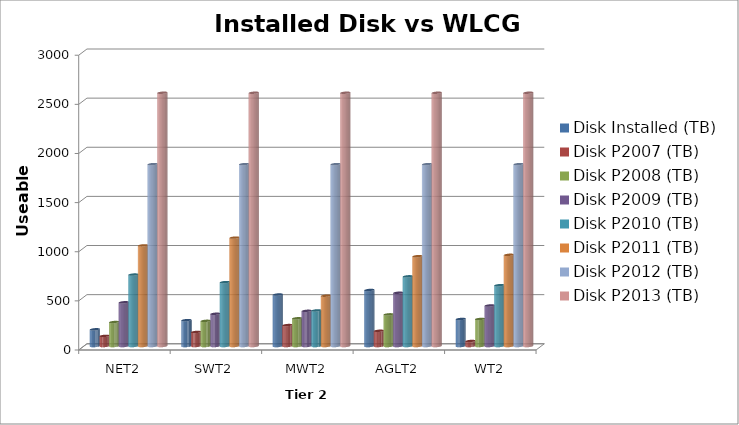
| Category | Disk Installed (TB) | Disk P2007 (TB) | Disk P2008 (TB) | Disk P2009 (TB) | Disk P2010 (TB) | Disk P2011 (TB) | Disk P2012 (TB) | Disk P2013 (TB) |
|---|---|---|---|---|---|---|---|---|
| NET2 | 170 | 103 | 244 | 445 | 727 | 1024 | 1851 | 2577.6 |
| SWT2 | 263 | 143 | 256 | 328 | 650 | 1103 | 1851 | 2577.6 |
| MWT2 | 524 | 213 | 282 | 358 | 362 | 512 | 1851 | 2577.6 |
| AGLT2 | 570 | 155 | 322 | 542 | 709 | 914 | 1851 | 2577.6 |
| WT2 | 275 | 51 | 275 | 412.5 | 618.75 | 928.125 | 1851 | 2577.6 |